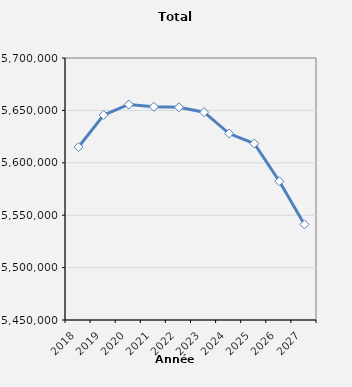
| Category | Total effectifs |
|---|---|
| 2018.0 | 5615100 |
| 2019.0 | 5645593 |
| 2020.0 | 5655644 |
| 2021.0 | 5653435 |
| 2022.0 | 5652973 |
| 2023.0 | 5648300 |
| 2024.0 | 5627900 |
| 2025.0 | 5618400 |
| 2026.0 | 5582400 |
| 2027.0 | 5541200 |